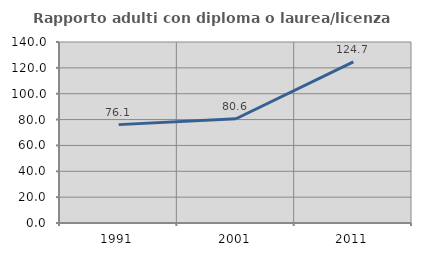
| Category | Rapporto adulti con diploma o laurea/licenza media  |
|---|---|
| 1991.0 | 76.091 |
| 2001.0 | 80.635 |
| 2011.0 | 124.669 |